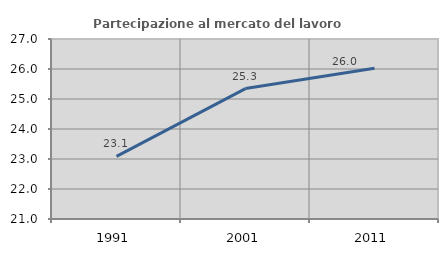
| Category | Partecipazione al mercato del lavoro  femminile |
|---|---|
| 1991.0 | 23.089 |
| 2001.0 | 25.348 |
| 2011.0 | 26.025 |